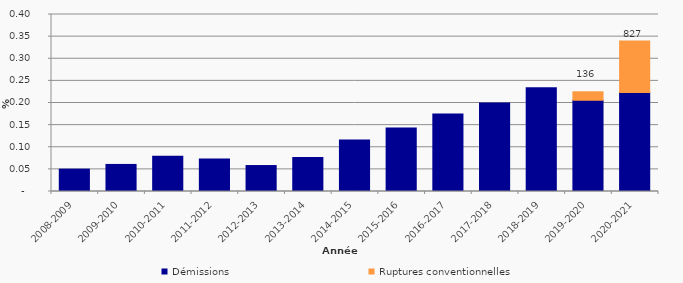
| Category | Démissions | Ruptures conventionnelles |
|---|---|---|
| 2008-2009 | 0.051 | 0 |
| 2009-2010 | 0.061 | 0 |
| 2010-2011 | 0.08 | 0 |
| 2011-2012 | 0.073 | 0 |
| 2012-2013 | 0.059 | 0 |
| 2013-2014 | 0.077 | 0 |
| 2014-2015 | 0.116 | 0 |
| 2015-2016 | 0.143 | 0 |
| 2016-2017 | 0.175 | 0 |
| 2017-2018 | 0.2 | 0 |
| 2018-2019 | 0.234 | 0 |
| 2019-2020 | 0.206 | 0.019 |
| 2020-2021 | 0.223 | 0.117 |